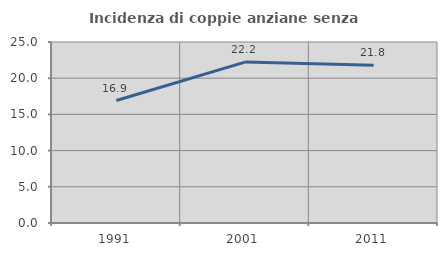
| Category | Incidenza di coppie anziane senza figli  |
|---|---|
| 1991.0 | 16.915 |
| 2001.0 | 22.222 |
| 2011.0 | 21.795 |